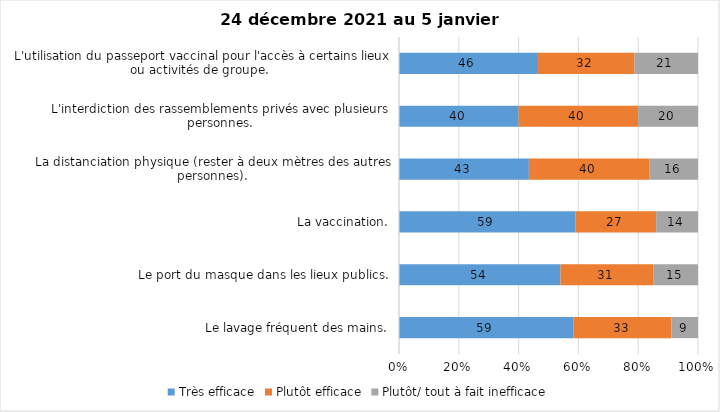
| Category | Très efficace | Plutôt efficace | Plutôt/ tout à fait inefficace |
|---|---|---|---|
| Le lavage fréquent des mains. | 59 | 33 | 9 |
| Le port du masque dans les lieux publics. | 54 | 31 | 15 |
| La vaccination. | 59 | 27 | 14 |
| La distanciation physique (rester à deux mètres des autres personnes). | 43 | 40 | 16 |
| L'interdiction des rassemblements privés avec plusieurs personnes. | 40 | 40 | 20 |
| L'utilisation du passeport vaccinal pour l'accès à certains lieux ou activités de groupe.  | 46 | 32 | 21 |